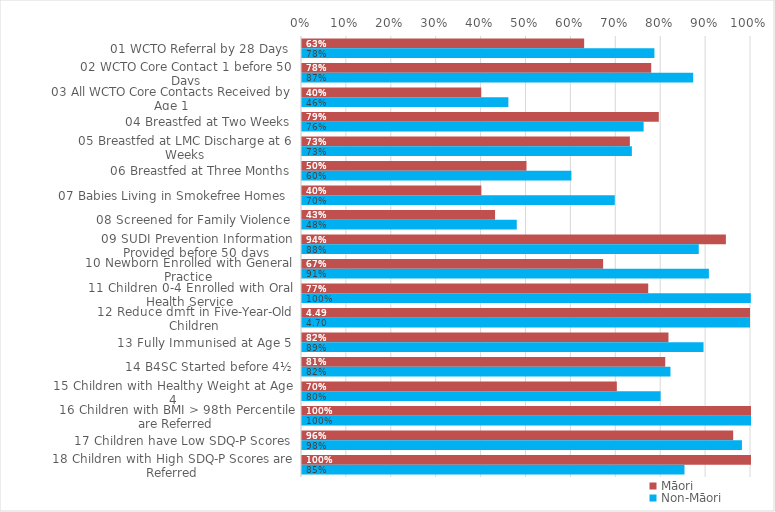
| Category | Māori | Non-Māori |
|---|---|---|
| 01 WCTO Referral by 28 Days | 0.628 | 0.785 |
| 02 WCTO Core Contact 1 before 50 Days | 0.778 | 0.871 |
| 03 All WCTO Core Contacts Received by Age 1 | 0.399 | 0.46 |
| 04 Breastfed at Two Weeks | 0.795 | 0.761 |
| 05 Breastfed at LMC Discharge at 6 Weeks | 0.73 | 0.735 |
| 06 Breastfed at Three Months | 0.5 | 0.6 |
| 07 Babies Living in Smokefree Homes  | 0.399 | 0.697 |
| 08 Screened for Family Violence | 0.43 | 0.478 |
| 09 SUDI Prevention Information Provided before 50 days | 0.944 | 0.884 |
| 10 Newborn Enrolled with General Practice | 0.671 | 0.906 |
| 11 Children 0-4 Enrolled with Oral Health Service | 0.771 | 1 |
| 12 Reduce dmft in Five-Year-Old Children | 4.491 | 4.699 |
| 13 Fully Immunised at Age 5 | 0.816 | 0.894 |
| 14 B4SC Started before 4½ | 0.809 | 0.821 |
| 15 Children with Healthy Weight at Age 4 | 0.701 | 0.799 |
| 16 Children with BMI > 98th Percentile are Referred | 1 | 1 |
| 17 Children have Low SDQ-P Scores | 0.96 | 0.98 |
| 18 Children with High SDQ-P Scores are Referred | 1 | 0.852 |